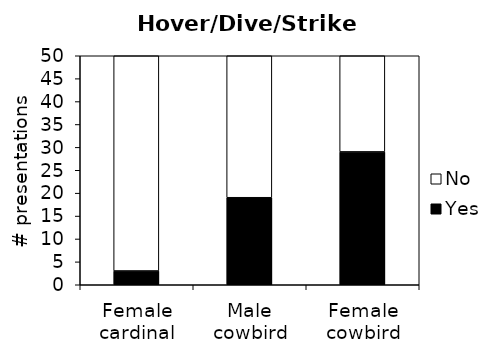
| Category | Yes | No |
|---|---|---|
| Female cardinal | 3 | 47 |
| Male cowbird | 19 | 31 |
| Female cowbird | 29 | 21 |